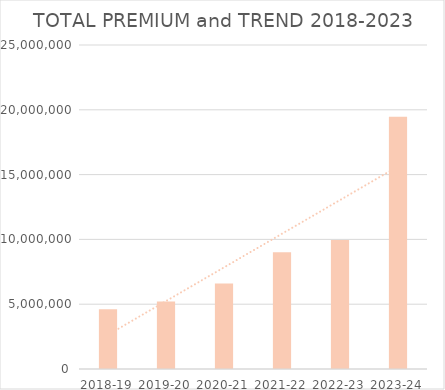
| Category | Series 0 | Series 1 | Series 2 | Series 3 |
|---|---|---|---|---|
| 2018-19 |  |  |  | 4612126 |
| 2019-20 |  |  |  | 5202404 |
| 2020-21 |  |  |  | 6591842.36 |
| 2021-22 |  |  |  | 9003630 |
| 2022-23 |  |  |  | 9944241.25 |
| 2023-24 |  |  |  | 19470786.8 |